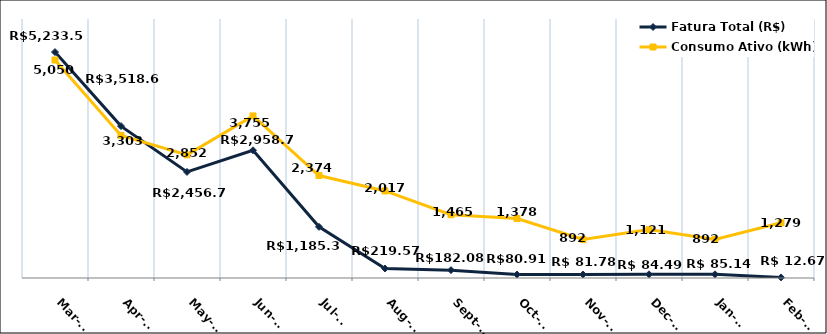
| Category | Fatura Total (R$) | Consumo Ativo (kWh) |
|---|---|---|
| 2022-03-01 | 5233.53 | 5050 |
| 2022-04-01 | 3518.61 | 3303 |
| 2022-05-01 | 2456.71 | 2852 |
| 2022-06-01 | 2958.72 | 3755 |
| 2022-07-01 | 1185.32 | 2374 |
| 2022-08-01 | 219.57 | 2017 |
| 2022-09-01 | 182.08 | 1465 |
| 2022-10-01 | 80.91 | 1378 |
| 2022-11-01 | 81.78 | 892 |
| 2022-12-01 | 84.49 | 1121 |
| 2023-01-01 | 85.14 | 892 |
| 2023-02-01 | 12.67 | 1279 |